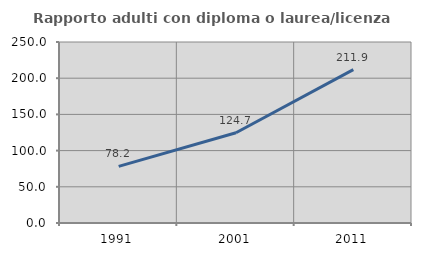
| Category | Rapporto adulti con diploma o laurea/licenza media  |
|---|---|
| 1991.0 | 78.198 |
| 2001.0 | 124.663 |
| 2011.0 | 211.933 |